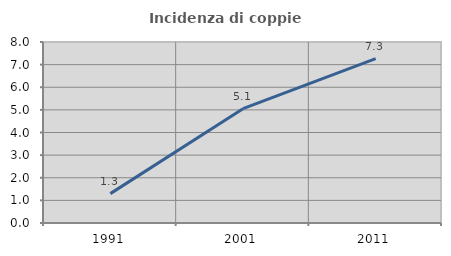
| Category | Incidenza di coppie miste |
|---|---|
| 1991.0 | 1.299 |
| 2001.0 | 5.054 |
| 2011.0 | 7.267 |